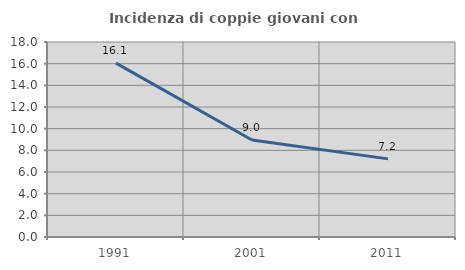
| Category | Incidenza di coppie giovani con figli |
|---|---|
| 1991.0 | 16.054 |
| 2001.0 | 8.959 |
| 2011.0 | 7.211 |